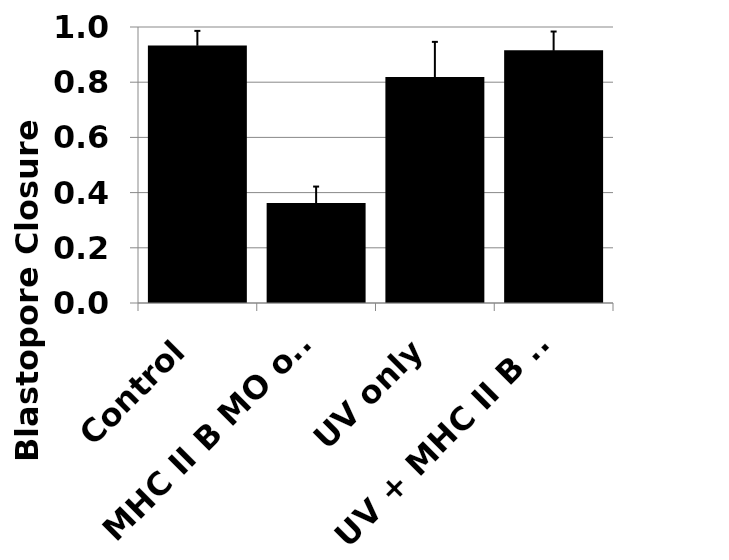
| Category | mean |
|---|---|
| Control | 0.933 |
| MHC II B MO only | 0.362 |
| UV only | 0.819 |
| UV + MHC II B MO | 0.915 |